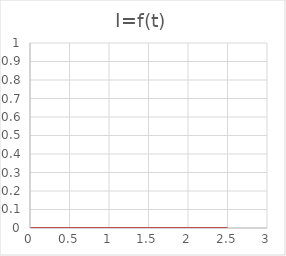
| Category | i=f(t) |
|---|---|
| 0.0 | 0 |
| 0.125 | 0 |
| 0.25 | 0 |
| 0.375 | 0 |
| 0.5 | 0 |
| 0.625 | 0 |
| 0.75 | 0 |
| 0.875 | 0 |
| 1.0 | 0 |
| 1.125 | 0 |
| 1.25 | 0 |
| 1.375 | 0 |
| 1.5 | 0 |
| 1.625 | 0 |
| 1.75 | 0 |
| 1.875 | 0 |
| 2.0 | 0 |
| 2.125 | 0 |
| 2.25 | 0 |
| 2.375 | 0 |
| 2.5 | 0 |